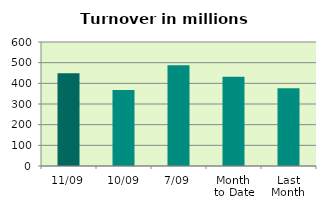
| Category | Series 0 |
|---|---|
| 11/09 | 448.476 |
| 10/09 | 367.624 |
| 7/09 | 487.232 |
| Month 
to Date | 432 |
| Last
Month | 376.258 |